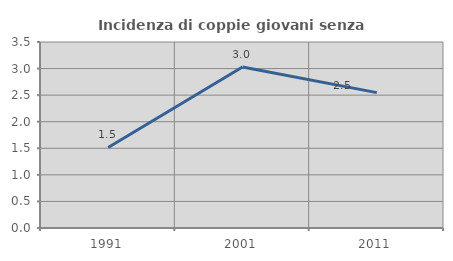
| Category | Incidenza di coppie giovani senza figli |
|---|---|
| 1991.0 | 1.515 |
| 2001.0 | 3.03 |
| 2011.0 | 2.548 |